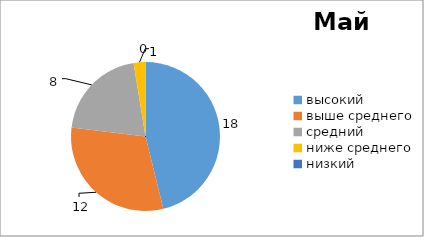
| Category | Series 0 |
|---|---|
| высокий  | 18 |
| выше среднего | 12 |
| средний | 8 |
| ниже среднего | 1 |
| низкий | 0 |